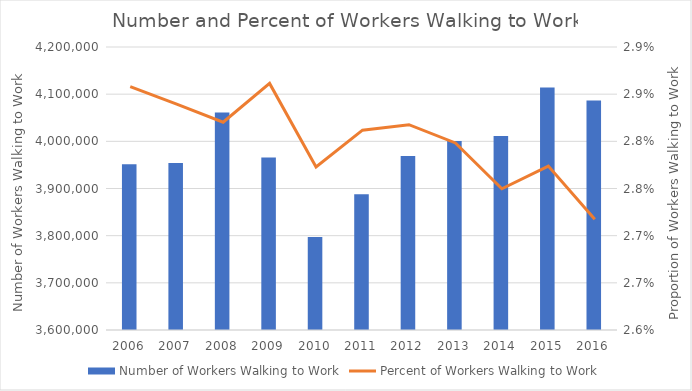
| Category | Number of Workers Walking to Work |
|---|---|
| 2006.0 | 3951534 |
| 2007.0 | 3954210 |
| 2008.0 | 4060994 |
| 2009.0 | 3965659 |
| 2010.0 | 3797048 |
| 2011.0 | 3887969 |
| 2012.0 | 3969058 |
| 2013.0 | 4000459 |
| 2014.0 | 4011094 |
| 2015.0 | 4114125 |
| 2016.0 | 4086487 |